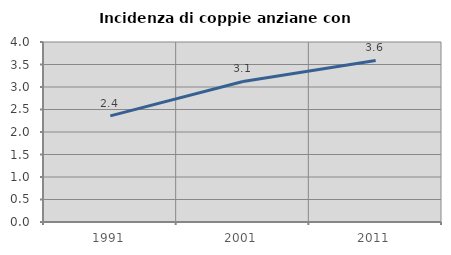
| Category | Incidenza di coppie anziane con figli |
|---|---|
| 1991.0 | 2.357 |
| 2001.0 | 3.122 |
| 2011.0 | 3.59 |